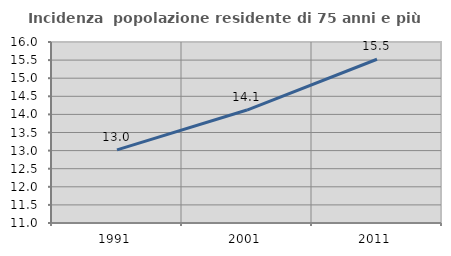
| Category | Incidenza  popolazione residente di 75 anni e più |
|---|---|
| 1991.0 | 13.021 |
| 2001.0 | 14.121 |
| 2011.0 | 15.524 |